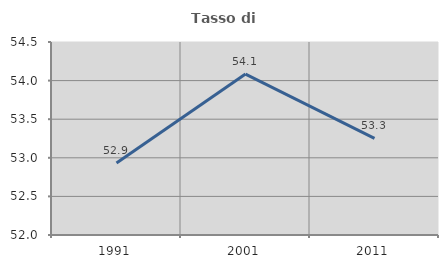
| Category | Tasso di occupazione   |
|---|---|
| 1991.0 | 52.931 |
| 2001.0 | 54.084 |
| 2011.0 | 53.251 |